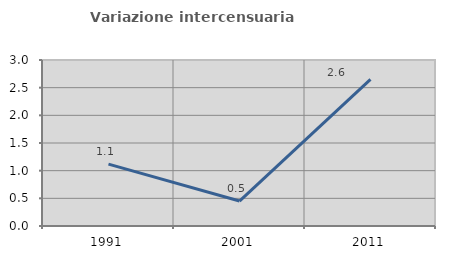
| Category | Variazione intercensuaria annua |
|---|---|
| 1991.0 | 1.118 |
| 2001.0 | 0.451 |
| 2011.0 | 2.648 |